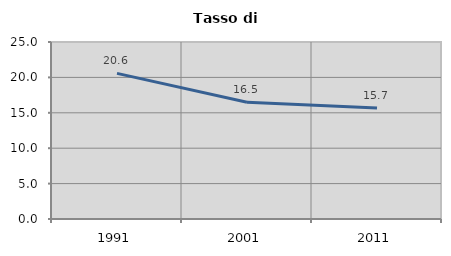
| Category | Tasso di disoccupazione   |
|---|---|
| 1991.0 | 20.567 |
| 2001.0 | 16.482 |
| 2011.0 | 15.663 |